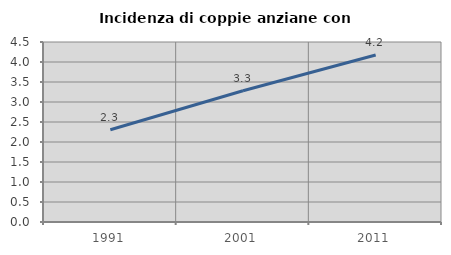
| Category | Incidenza di coppie anziane con figli |
|---|---|
| 1991.0 | 2.308 |
| 2001.0 | 3.28 |
| 2011.0 | 4.175 |